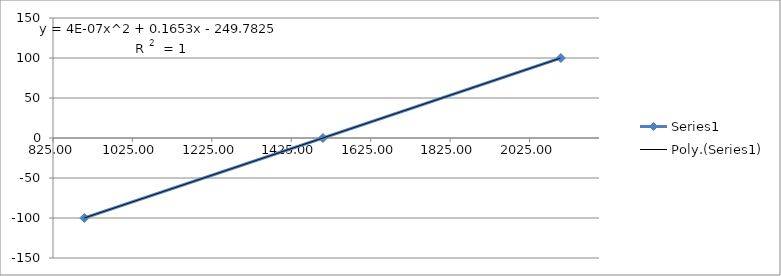
| Category | Series 0 |
|---|---|
| 2103.824 | 100 |
| 1504.752 | 0 |
| 903.772 | -100 |